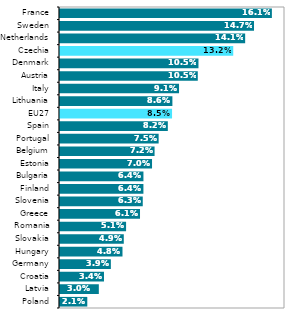
| Category | Series 1 |
|---|---|
| Poland | 0.021 |
| Latvia | 0.03 |
| Croatia | 0.034 |
| Germany | 0.039 |
| Hungary | 0.048 |
| Slovakia | 0.049 |
| Romania | 0.051 |
| Greece | 0.061 |
| Slovenia | 0.063 |
| Finland | 0.064 |
| Bulgaria | 0.064 |
| Estonia | 0.07 |
| Belgium | 0.072 |
| Portugal | 0.075 |
| Spain | 0.082 |
| EU27 | 0.085 |
| Lithuania | 0.086 |
| Italy | 0.091 |
| Austria | 0.105 |
| Denmark | 0.105 |
| Czechia | 0.132 |
| Netherlands | 0.141 |
| Sweden | 0.147 |
| France | 0.161 |